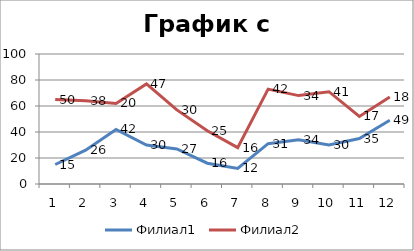
| Category | Филиал1 | Филиал2 |
|---|---|---|
| 0 | 15 | 50 |
| 1 | 26 | 38 |
| 2 | 42 | 20 |
| 3 | 30 | 47 |
| 4 | 27 | 30 |
| 5 | 16 | 25 |
| 6 | 12 | 16 |
| 7 | 31 | 42 |
| 8 | 34 | 34 |
| 9 | 30 | 41 |
| 10 | 35 | 17 |
| 11 | 49 | 18 |